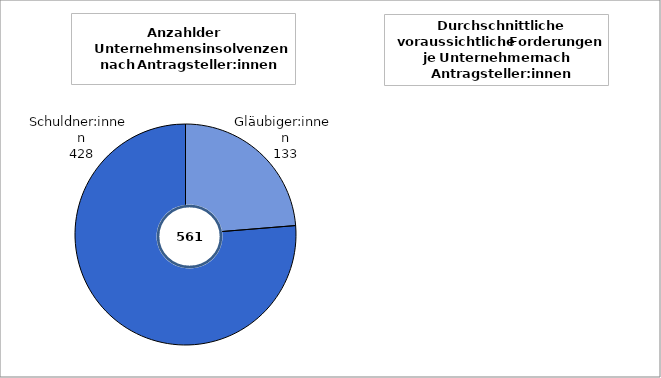
| Category | Series 0 |
|---|---|
| Gläubiger:innen | 133 |
| Schuldner:innen | 428 |